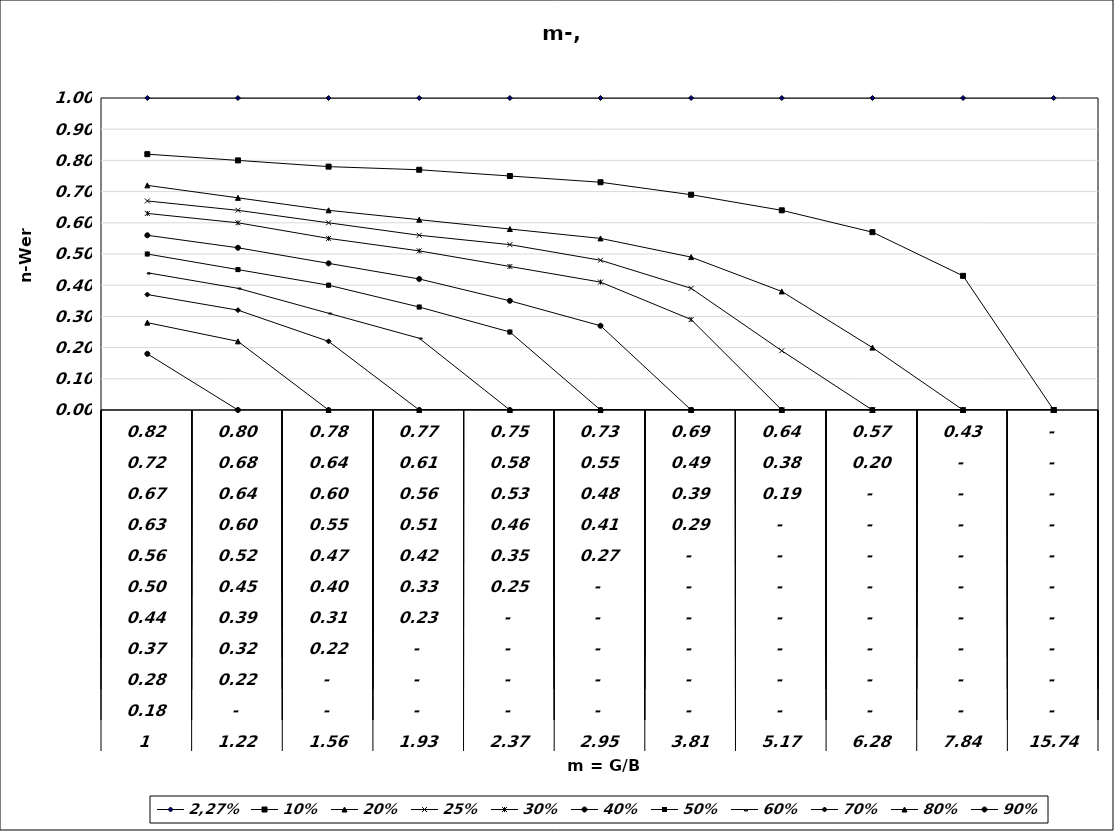
| Category | 2,27% | 10% | 20% | 25% | 30% | 40% | 50% | 60% | 70% | 80% | 90% |
|---|---|---|---|---|---|---|---|---|---|---|---|
| 1.0 | 1 | 0.82 | 0.72 | 0.67 | 0.63 | 0.56 | 0.5 | 0.44 | 0.37 | 0.28 | 0.18 |
| 1.22 | 1 | 0.8 | 0.68 | 0.64 | 0.6 | 0.52 | 0.45 | 0.39 | 0.32 | 0.22 | 0 |
| 1.56 | 1 | 0.78 | 0.64 | 0.6 | 0.55 | 0.47 | 0.4 | 0.31 | 0.22 | 0 | 0 |
| 1.93 | 1 | 0.77 | 0.61 | 0.56 | 0.51 | 0.42 | 0.33 | 0.23 | 0 | 0 | 0 |
| 2.37 | 1 | 0.75 | 0.58 | 0.53 | 0.46 | 0.35 | 0.25 | 0 | 0 | 0 | 0 |
| 2.95 | 1 | 0.73 | 0.55 | 0.48 | 0.41 | 0.27 | 0 | 0 | 0 | 0 | 0 |
| 3.81 | 1 | 0.69 | 0.49 | 0.39 | 0.29 | 0 | 0 | 0 | 0 | 0 | 0 |
| 5.17 | 1 | 0.64 | 0.38 | 0.19 | 0 | 0 | 0 | 0 | 0 | 0 | 0 |
| 6.28 | 1 | 0.57 | 0.2 | 0 | 0 | 0 | 0 | 0 | 0 | 0 | 0 |
| 7.84 | 1 | 0.43 | 0 | 0 | 0 | 0 | 0 | 0 | 0 | 0 | 0 |
| 15.74 | 1 | 0 | 0 | 0 | 0 | 0 | 0 | 0 | 0 | 0 | 0 |